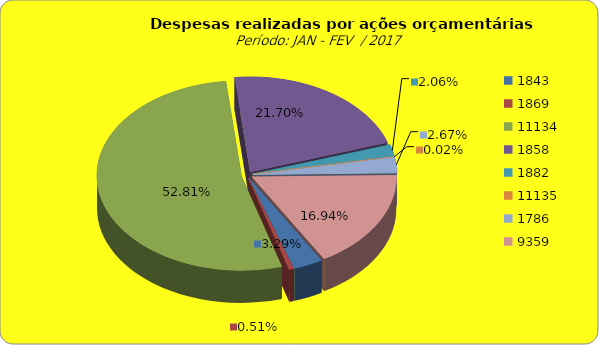
| Category | Series 1 |
|---|---|
| 1843.0 | 1812525.28 |
| 1869.0 | 282799.74 |
| 11134.0 | 29125785.61 |
| 1858.0 | 11966769.55 |
| 1882.0 | 1135224.11 |
| 11135.0 | 9196 |
| 1786.0 | 1472725.33 |
| 9359.0 | 9341993.09 |